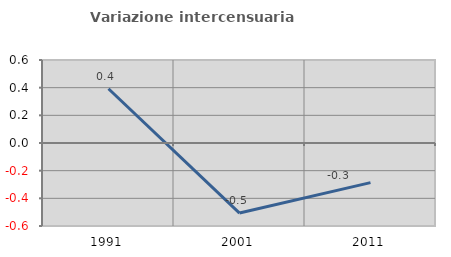
| Category | Variazione intercensuaria annua |
|---|---|
| 1991.0 | 0.392 |
| 2001.0 | -0.507 |
| 2011.0 | -0.286 |